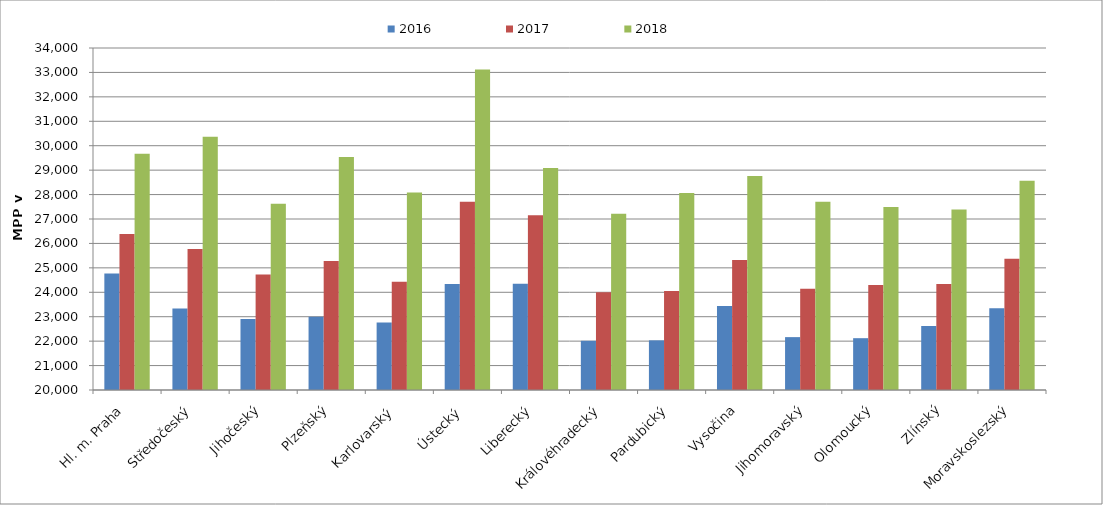
| Category | 2016 | 2017 | 2018 |
|---|---|---|---|
| Hl. m. Praha | 24770.878 | 26383 | 29669.767 |
| Středočeský | 23331.84 | 25768.792 | 30369.547 |
| Jihočeský | 22908.82 | 24725.5 | 27628.463 |
| Plzeňský | 23000 | 25276.8 | 29535.648 |
| Karlovarský  | 22759.044 | 24426.732 | 28087.167 |
| Ústecký   | 24340.816 | 27709.589 | 33121.956 |
| Liberecký | 24345.26 | 27149.717 | 29086.696 |
| Královéhradecký | 22013.729 | 24000 | 27210.501 |
| Pardubický | 22033.133 | 24053.04 | 28063.473 |
| Vysočina | 23443.051 | 25318.659 | 28756.292 |
| Jihomoravský | 22164.489 | 24147.751 | 27707.79 |
| Olomoucký | 22121.116 | 24297.569 | 27486.367 |
| Zlínský | 22620.239 | 24338.598 | 27386.728 |
| Moravskoslezský | 23344.509 | 25372.442 | 28563.3 |